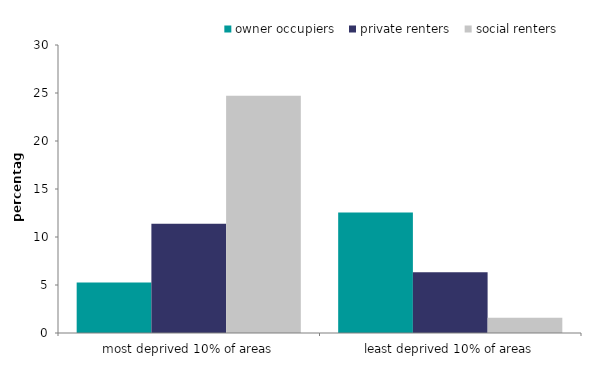
| Category | owner occupiers | private renters | social renters |
|---|---|---|---|
| most deprived 10% of areas | 5.266 | 11.372 | 24.719 |
| least deprived 10% of areas | 12.565 | 6.331 | 1.576 |